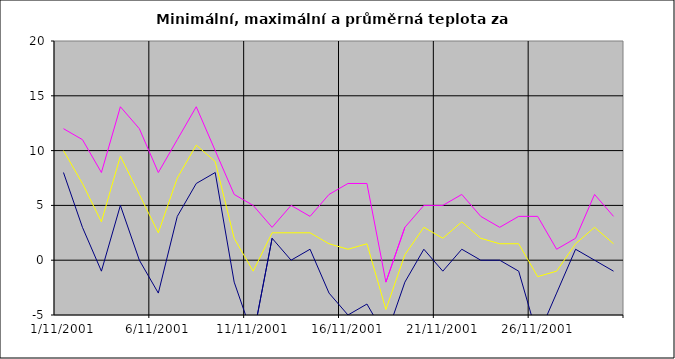
| Category | Series 0 | Series 1 | Series 2 |
|---|---|---|---|
| 2001-11-01 | 8 | 12 | 10 |
| 2001-11-02 | 3 | 11 | 7 |
| 2001-11-03 | -1 | 8 | 3.5 |
| 2001-11-04 | 5 | 14 | 9.5 |
| 2001-11-05 | 0 | 12 | 6 |
| 2001-11-06 | -3 | 8 | 2.5 |
| 2001-11-07 | 4 | 11 | 7.5 |
| 2001-11-08 | 7 | 14 | 10.5 |
| 2001-11-09 | 8 | 10 | 9 |
| 2001-11-10 | -2 | 6 | 2 |
| 2001-11-11 | -7 | 5 | -1 |
| 2001-11-12 | 2 | 3 | 2.5 |
| 2001-11-13 | 0 | 5 | 2.5 |
| 2001-11-14 | 1 | 4 | 2.5 |
| 2001-11-15 | -3 | 6 | 1.5 |
| 2001-11-16 | -5 | 7 | 1 |
| 2001-11-17 | -4 | 7 | 1.5 |
| 2001-11-18 | -7 | -2 | -4.5 |
| 2001-11-19 | -2 | 3 | 0.5 |
| 2001-11-20 | 1 | 5 | 3 |
| 2001-11-21 | -1 | 5 | 2 |
| 2001-11-22 | 1 | 6 | 3.5 |
| 2001-11-23 | 0 | 4 | 2 |
| 2001-11-24 | 0 | 3 | 1.5 |
| 2001-11-25 | -1 | 4 | 1.5 |
| 2001-11-26 | -7 | 4 | -1.5 |
| 2001-11-27 | -3 | 1 | -1 |
| 2001-11-28 | 1 | 2 | 1.5 |
| 2001-11-29 | 0 | 6 | 3 |
| 2001-11-30 | -1 | 4 | 1.5 |